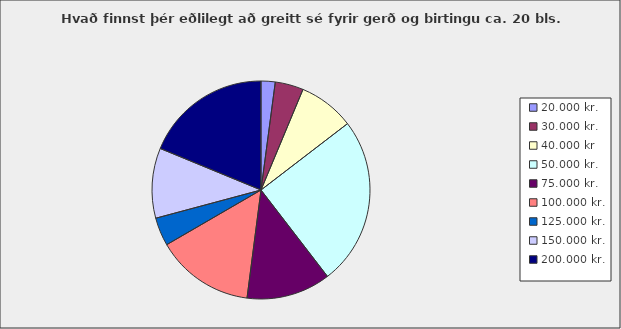
| Category | Series 0 |
|---|---|
| 20.000 kr. | 0.021 |
| 30.000 kr. | 0.042 |
| 40.000 kr | 0.083 |
| 50.000 kr. | 0.25 |
| 75.000 kr. | 0.125 |
| 100.000 kr. | 0.146 |
| 125.000 kr. | 0.042 |
| 150.000 kr. | 0.104 |
| 200.000 kr. | 0.188 |